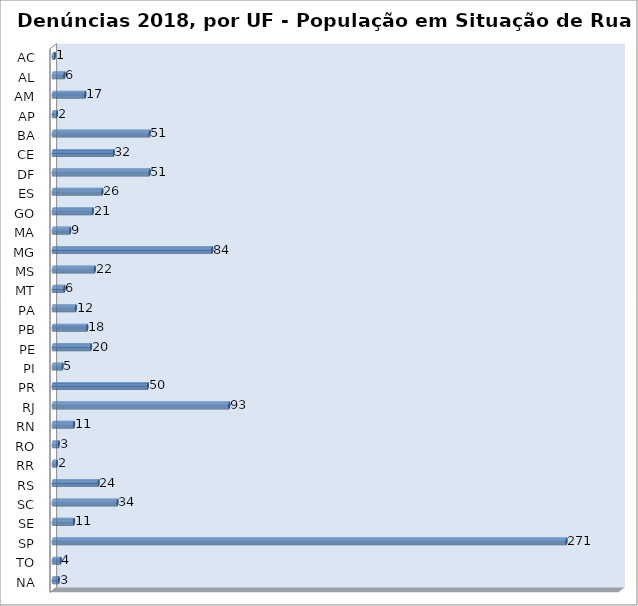
| Category | Series 0 |
|---|---|
| AC | 1 |
| AL | 6 |
| AM | 17 |
| AP | 2 |
| BA | 51 |
| CE | 32 |
| DF | 51 |
| ES | 26 |
| GO | 21 |
| MA | 9 |
| MG | 84 |
| MS | 22 |
| MT | 6 |
| PA | 12 |
| PB | 18 |
| PE | 20 |
| PI | 5 |
| PR | 50 |
| RJ | 93 |
| RN | 11 |
| RO | 3 |
| RR | 2 |
| RS | 24 |
| SC | 34 |
| SE | 11 |
| SP | 271 |
| TO | 4 |
| NA | 3 |